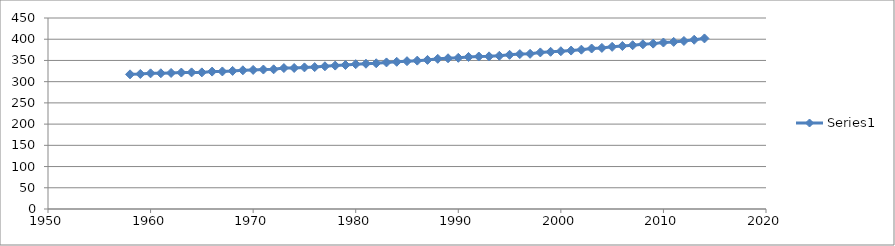
| Category | Series 0 |
|---|---|
| 1958.0 | 317.26 |
| 1959.0 | 318.15 |
| 1960.0 | 319.59 |
| 1961.0 | 319.77 |
| 1962.0 | 320.55 |
| 1963.0 | 321.48 |
| 1964.0 | 321.89 |
| 1965.0 | 321.87 |
| 1966.0 | 323.75 |
| 1967.0 | 324.09 |
| 1968.0 | 325.36 |
| 1969.0 | 326.76 |
| 1970.0 | 327.66 |
| 1971.0 | 328.57 |
| 1972.0 | 329.09 |
| 1973.0 | 332.07 |
| 1974.0 | 332.25 |
| 1975.0 | 333.6 |
| 1976.0 | 334.34 |
| 1977.0 | 336.27 |
| 1978.0 | 337.89 |
| 1979.0 | 339.29 |
| 1980.0 | 341.17 |
| 1981.0 | 342.25 |
| 1982.0 | 343.35 |
| 1983.0 | 345.32 |
| 1984.0 | 346.79 |
| 1985.0 | 348.25 |
| 1986.0 | 349.55 |
| 1987.0 | 351.25 |
| 1988.0 | 353.79 |
| 1989.0 | 355.12 |
| 1990.0 | 356.23 |
| 1991.0 | 358.24 |
| 1992.0 | 359.25 |
| 1993.0 | 359.6 |
| 1994.0 | 360.94 |
| 1995.0 | 363.26 |
| 1996.0 | 364.97 |
| 1997.0 | 365.62 |
| 1998.0 | 368.87 |
| 1999.0 | 370.35 |
| 2000.0 | 371.7 |
| 2001.0 | 373.3 |
| 2002.0 | 375.4 |
| 2003.0 | 378.13 |
| 2004.0 | 379.55 |
| 2005.0 | 382.08 |
| 2006.0 | 384.03 |
| 2007.0 | 385.87 |
| 2008.0 | 388.05 |
| 2009.0 | 389.62 |
| 2010.0 | 392.24 |
| 2011.0 | 393.69 |
| 2012.0 | 395.88 |
| 2013.0 | 398.78 |
| 2014.0 | 401.88 |